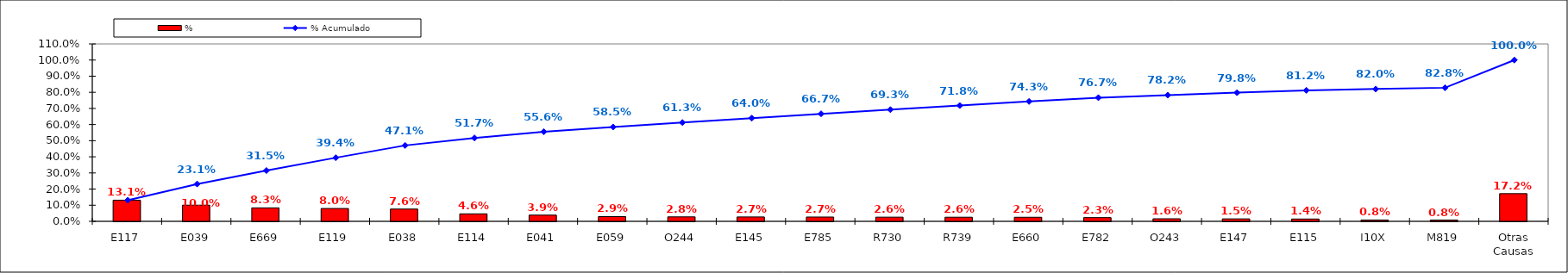
| Category | % |
|---|---|
| E117 | 0.131 |
| E039 | 0.1 |
| E669 | 0.083 |
| E119 | 0.08 |
| E038 | 0.076 |
| E114 | 0.046 |
| E041 | 0.039 |
| E059 | 0.029 |
| O244 | 0.028 |
| E145 | 0.027 |
| E785 | 0.027 |
| R730 | 0.026 |
| R739 | 0.026 |
| E660 | 0.025 |
| E782 | 0.023 |
| O243 | 0.016 |
| E147 | 0.015 |
| E115 | 0.014 |
| I10X | 0.008 |
| M819 | 0.008 |
| Otras Causas | 0.172 |